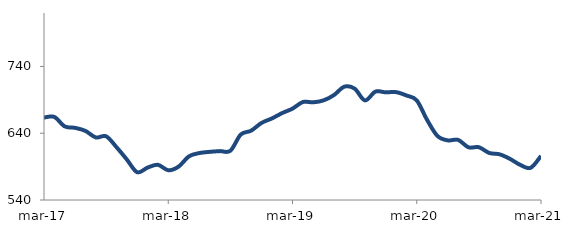
| Category | Series 0 |
|---|---|
| 2017-03-01 | 663.462 |
| 2017-04-01 | 664.337 |
| 2017-05-01 | 650.189 |
| 2017-06-01 | 648.006 |
| 2017-07-01 | 643.488 |
| 2017-08-01 | 633.681 |
| 2017-09-01 | 635.346 |
| 2017-10-01 | 619.124 |
| 2017-11-01 | 600.625 |
| 2017-12-01 | 581.589 |
| 2018-01-01 | 588.491 |
| 2018-02-01 | 592.7 |
| 2018-03-01 | 584.54 |
| 2018-04-01 | 590.003 |
| 2018-05-01 | 605.353 |
| 2018-06-01 | 610.275 |
| 2018-07-01 | 612.086 |
| 2018-08-01 | 613.193 |
| 2018-09-01 | 613.735 |
| 2018-10-01 | 637.954 |
| 2018-11-01 | 643.773 |
| 2018-12-01 | 655.34 |
| 2019-01-01 | 662.041 |
| 2019-02-01 | 670.134 |
| 2019-03-01 | 676.827 |
| 2019-04-01 | 686.669 |
| 2019-05-01 | 686.255 |
| 2019-06-01 | 689.181 |
| 2019-07-01 | 697.076 |
| 2019-08-01 | 709.635 |
| 2019-09-01 | 706.734 |
| 2019-10-01 | 689.137 |
| 2019-11-01 | 702.277 |
| 2019-12-01 | 701.214 |
| 2020-01-01 | 701.517 |
| 2020-02-01 | 696.552 |
| 2020-03-01 | 689.099 |
| 2020-04-01 | 659.896 |
| 2020-05-01 | 635.894 |
| 2020-06-01 | 629.29 |
| 2020-07-01 | 629.994 |
| 2020-08-01 | 618.866 |
| 2020-09-01 | 619.022 |
| 2020-10-01 | 610.428 |
| 2020-11-01 | 608.402 |
| 2020-12-01 | 601.605 |
| 2021-01-01 | 592.504 |
| 2021-02-01 | 588.185 |
| 2021-03-01 | 605.989 |